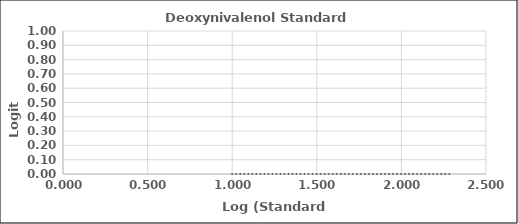
| Category | Series 0 |
|---|---|
| 1.0 | 0 |
| 1.3010299956639813 | 0 |
| 1.6989700043360187 | 0 |
| 2.0 | 0 |
| 2.3010299956639813 | 0 |